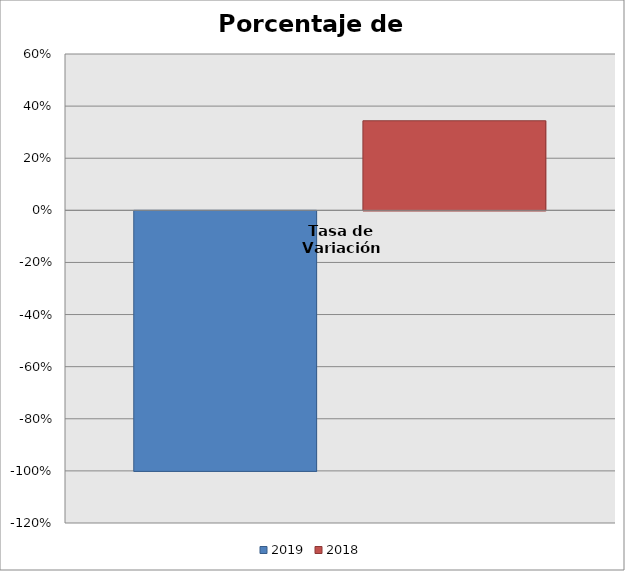
| Category | 2019 | 2018 |
|---|---|---|
| 0 | -1 | 0.344 |